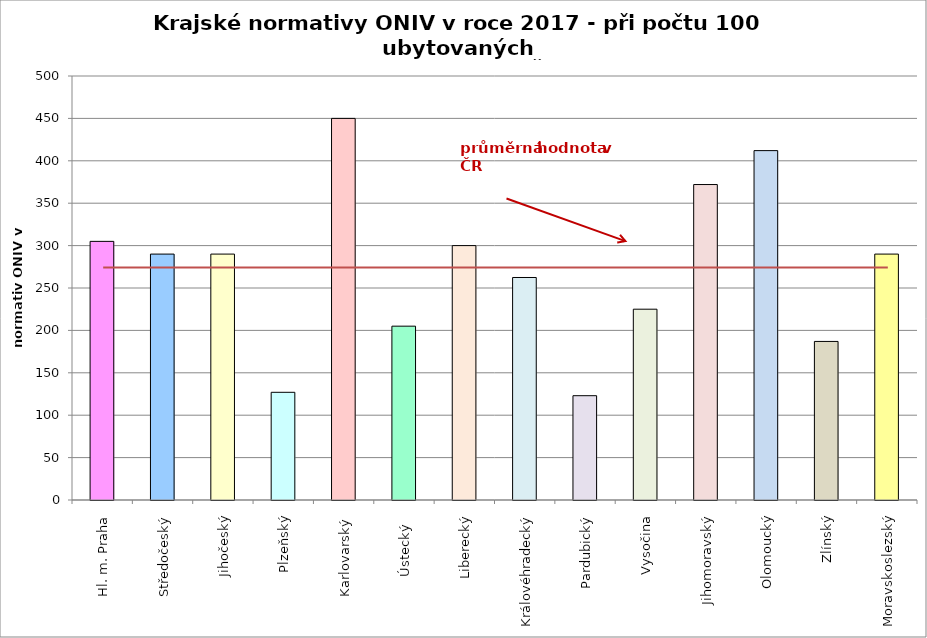
| Category | Series 0 |
|---|---|
| Hl. m. Praha | 305 |
| Středočeský | 290 |
| Jihočeský | 290 |
| Plzeňský | 127 |
| Karlovarský  | 450 |
| Ústecký   | 205 |
| Liberecký | 300 |
| Královéhradecký | 262.4 |
| Pardubický | 123 |
| Vysočina | 225 |
| Jihomoravský | 372 |
| Olomoucký | 412 |
| Zlínský | 187 |
| Moravskoslezský | 290 |